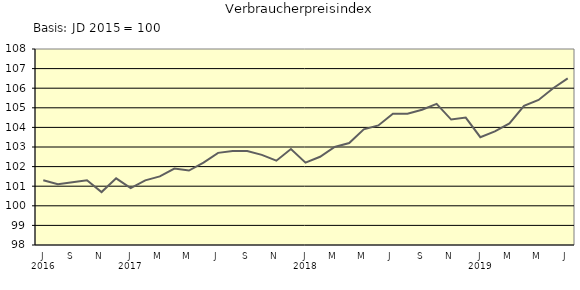
| Category | Series 0 |
|---|---|
| 0 | 101.3 |
| 1 | 101.1 |
| 2 | 101.2 |
| 3 | 101.3 |
| 4 | 100.7 |
| 5 | 101.4 |
| 6 | 100.9 |
| 7 | 101.3 |
| 8 | 101.5 |
| 9 | 101.9 |
| 10 | 101.8 |
| 11 | 102.2 |
| 12 | 102.7 |
| 13 | 102.8 |
| 14 | 102.8 |
| 15 | 102.6 |
| 16 | 102.3 |
| 17 | 102.9 |
| 18 | 102.2 |
| 19 | 102.5 |
| 20 | 103 |
| 21 | 103.2 |
| 22 | 103.9 |
| 23 | 104.1 |
| 24 | 104.7 |
| 25 | 104.7 |
| 26 | 104.9 |
| 27 | 105.2 |
| 28 | 104.4 |
| 29 | 104.5 |
| 30 | 103.5 |
| 31 | 103.8 |
| 32 | 104.2 |
| 33 | 105.1 |
| 34 | 105.4 |
| 35 | 106 |
| 36 | 106.5 |